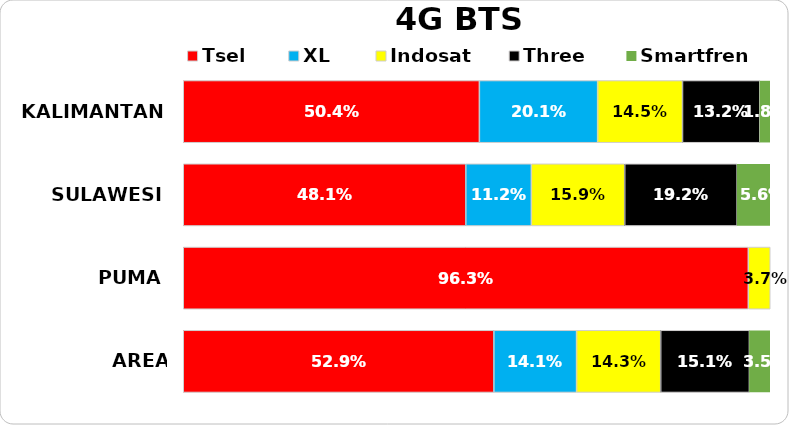
| Category | Tsel | XL | Indosat | Three | Smartfren |
|---|---|---|---|---|---|
| KALIMANTAN | 0.504 | 0.201 | 0.145 | 0.132 | 0.018 |
| SULAWESI | 0.481 | 0.112 | 0.159 | 0.192 | 0.056 |
| PUMA | 0.963 | 0 | 0.037 | 0 | 0 |
| AREA PAMASUKA | 0.529 | 0.141 | 0.143 | 0.151 | 0.035 |